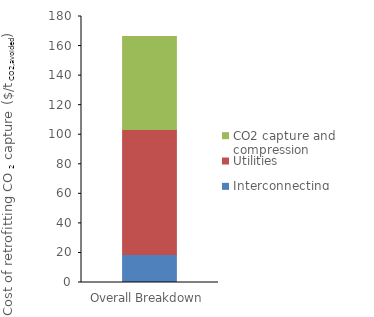
| Category | Interconnecting | Utilities | CO2 capture and compression |
|---|---|---|---|
| 0 | 18.974 | 84.594 | 62.929 |